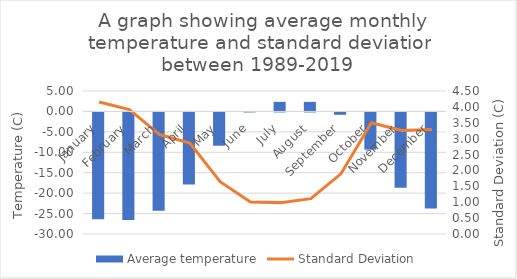
| Category | Average temperature |
|---|---|
| January | -26.145 |
| February | -26.313 |
| March | -24.054 |
| April | -17.67 |
| May | -8.145 |
| June | 0.097 |
| July | 2.348 |
| August | 2.336 |
| September | -0.582 |
| October | -9.103 |
| November | -18.436 |
| December | -23.521 |